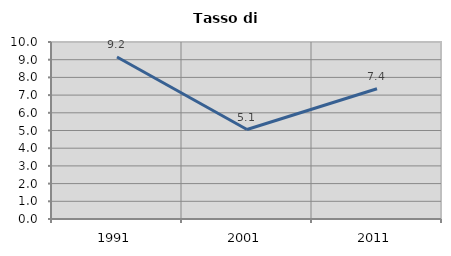
| Category | Tasso di disoccupazione   |
|---|---|
| 1991.0 | 9.156 |
| 2001.0 | 5.055 |
| 2011.0 | 7.356 |